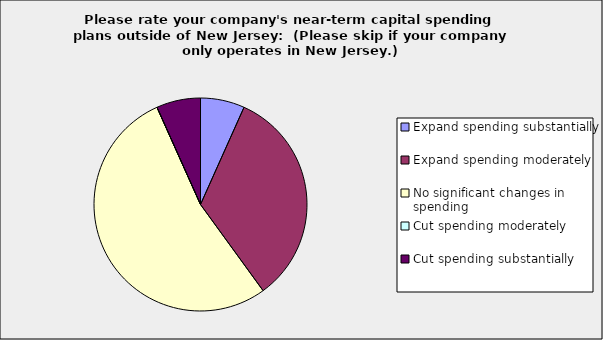
| Category | Series 0 |
|---|---|
| Expand spending substantially | 0.067 |
| Expand spending moderately | 0.333 |
| No significant changes in spending | 0.533 |
| Cut spending moderately | 0 |
| Cut spending substantially | 0.067 |